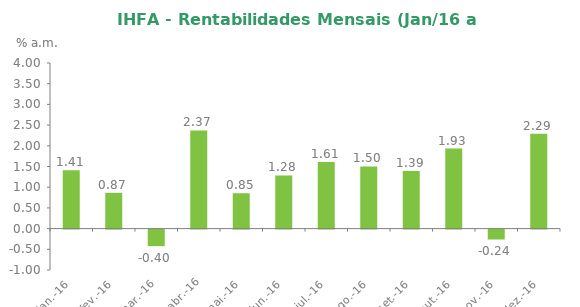
| Category | Series 0 |
|---|---|
| 2016-01-29 | 1.408 |
| 2016-02-29 | 0.865 |
| 2016-03-31 | -0.4 |
| 2016-04-30 | 2.37 |
| 2016-05-31 | 0.855 |
| 2016-06-30 | 1.284 |
| 2016-07-31 | 1.606 |
| 2016-08-31 | 1.501 |
| 2016-09-30 | 1.39 |
| 2016-10-31 | 1.934 |
| 2016-11-30 | -0.239 |
| 2016-12-31 | 2.288 |